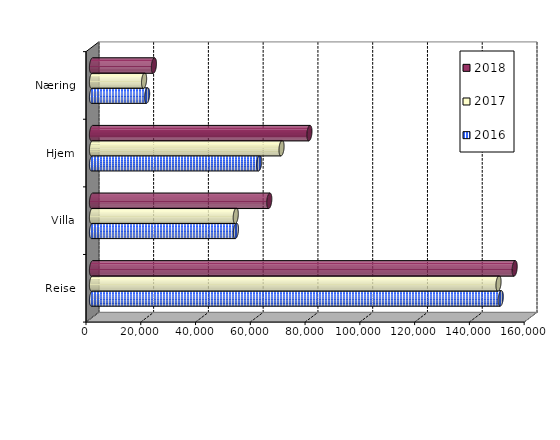
| Category | 2016 | 2017 | 2018 |
|---|---|---|---|
| Reise | 149261.141 | 148449 | 154340 |
| Villa | 52562.962 | 52500.266 | 64737.31 |
| Hjem | 61041.058 | 69216.435 | 79397.795 |
| Næring | 20119.271 | 19019.624 | 22608.497 |